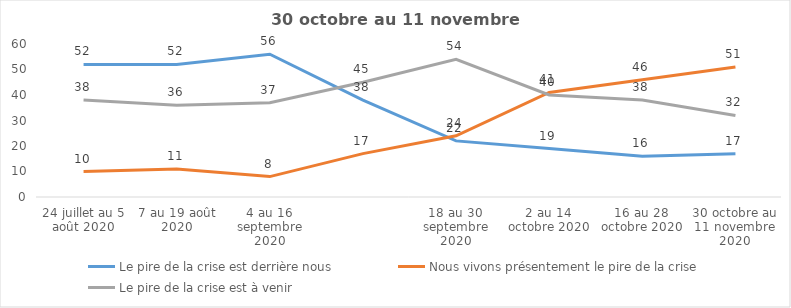
| Category | Le pire de la crise est derrière nous | Nous vivons présentement le pire de la crise | Le pire de la crise est à venir |
|---|---|---|---|
| 24 juillet au 5 août 2020 | 52 | 10 | 38 |
| 7 au 19 août 2020 | 52 | 11 | 36 |
| 4 au 16 septembre 2020 | 56 | 8 | 37 |
|  | 38 | 17 | 45 |
| 18 au 30 septembre 2020 | 22 | 24 | 54 |
| 2 au 14 octobre 2020 | 19 | 41 | 40 |
| 16 au 28 octobre 2020 | 16 | 46 | 38 |
| 30 octobre au 11 novembre 2020 | 17 | 51 | 32 |